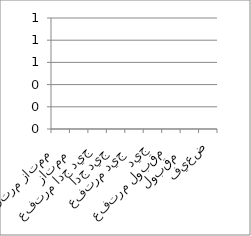
| Category | Series 0 |
|---|---|
| ممتاز مرتفع  | 0 |
| ممتاز   | 0 |
| جيد جدا مرتفع | 0 |
| جيد جدا  | 0 |
| جيد مرتفع  | 0 |
| جيد | 0 |
| مقبول مرتفع | 0 |
| مقبول   | 0 |
| ضعيف | 0 |